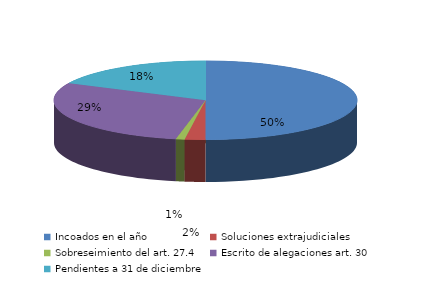
| Category | Series 0 |
|---|---|
| Incoados en el año | 160 |
| Soluciones extrajudiciales | 7 |
| Sobreseimiento del art. 27.4 | 3 |
| Escrito de alegaciones art. 30 | 93 |
| Pendientes a 31 de diciembre | 57 |